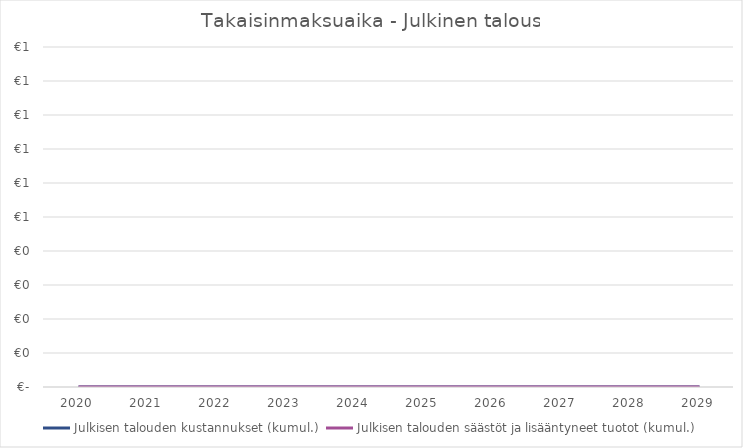
| Category | Julkisen talouden kustannukset (kumul.) | Julkisen talouden säästöt ja lisääntyneet tuotot (kumul.) |
|---|---|---|
| 2020.0 | 0 | 0 |
| 2021.0 | 0 | 0 |
| 2022.0 | 0 | 0 |
| 2023.0 | 0 | 0 |
| 2024.0 | 0 | 0 |
| 2025.0 | 0 | 0 |
| 2026.0 | 0 | 0 |
| 2027.0 | 0 | 0 |
| 2028.0 | 0 | 0 |
| 2029.0 | 0 | 0 |